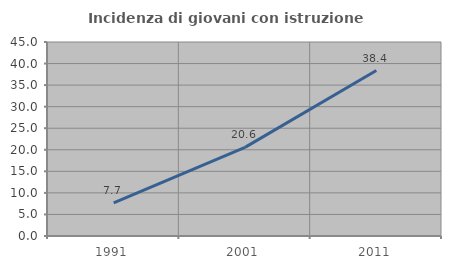
| Category | Incidenza di giovani con istruzione universitaria |
|---|---|
| 1991.0 | 7.692 |
| 2001.0 | 20.563 |
| 2011.0 | 38.376 |